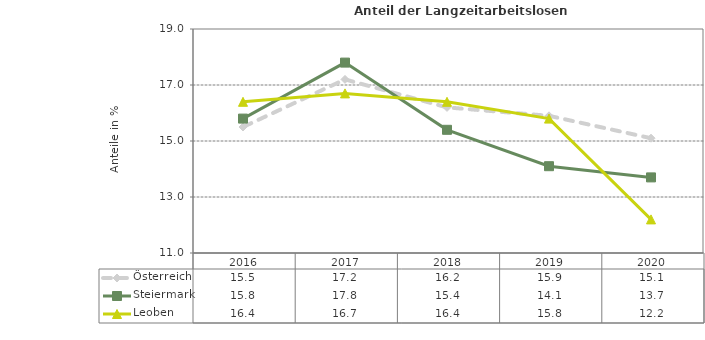
| Category | Österreich | Steiermark | Leoben |
|---|---|---|---|
| 2020.0 | 15.1 | 13.7 | 12.2 |
| 2019.0 | 15.9 | 14.1 | 15.8 |
| 2018.0 | 16.2 | 15.4 | 16.4 |
| 2017.0 | 17.2 | 17.8 | 16.7 |
| 2016.0 | 15.5 | 15.8 | 16.4 |